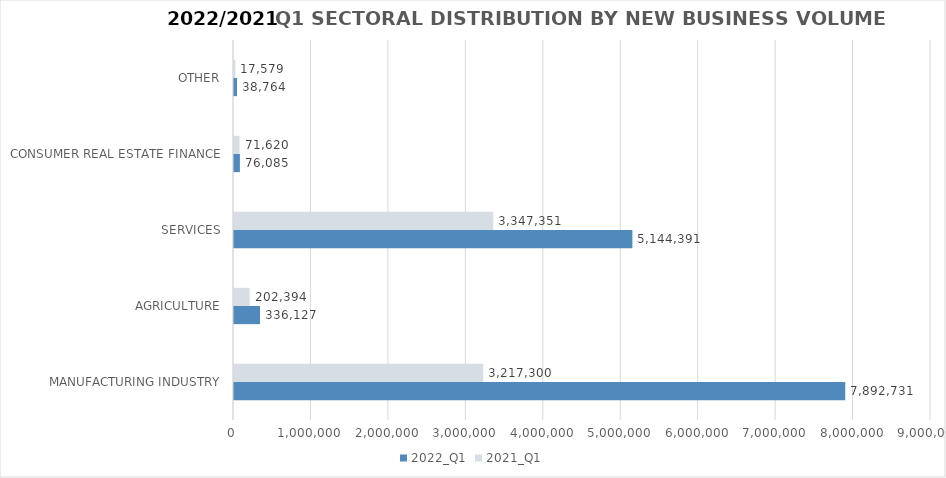
| Category | 2022_Q1 | 2021_Q1 |
|---|---|---|
| MANUFACTURING INDUSTRY | 7892731.388 | 3217299.68 |
| AGRICULTURE | 336127.332 | 202393.634 |
| SERVICES | 5144391.017 | 3347350.986 |
| CONSUMER REAL ESTATE FINANCE | 76085 | 71620 |
| OTHER | 38764 | 17579 |